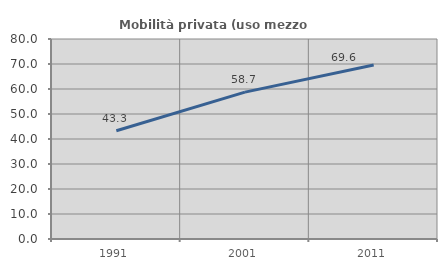
| Category | Mobilità privata (uso mezzo privato) |
|---|---|
| 1991.0 | 43.289 |
| 2001.0 | 58.749 |
| 2011.0 | 69.608 |